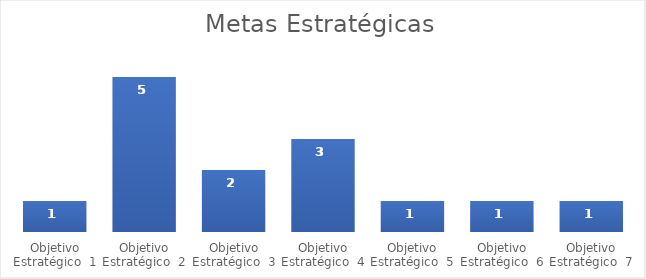
| Category | Metas Estrategicas |
|---|---|
| Objetivo Estratégico  1 | 1 |
| Objetivo Estratégico  2 | 5 |
| Objetivo Estratégico  3 | 2 |
| Objetivo Estratégico  4 | 3 |
| Objetivo Estratégico  5 | 1 |
| Objetivo Estratégico  6 | 1 |
| Objetivo Estratégico  7 | 1 |